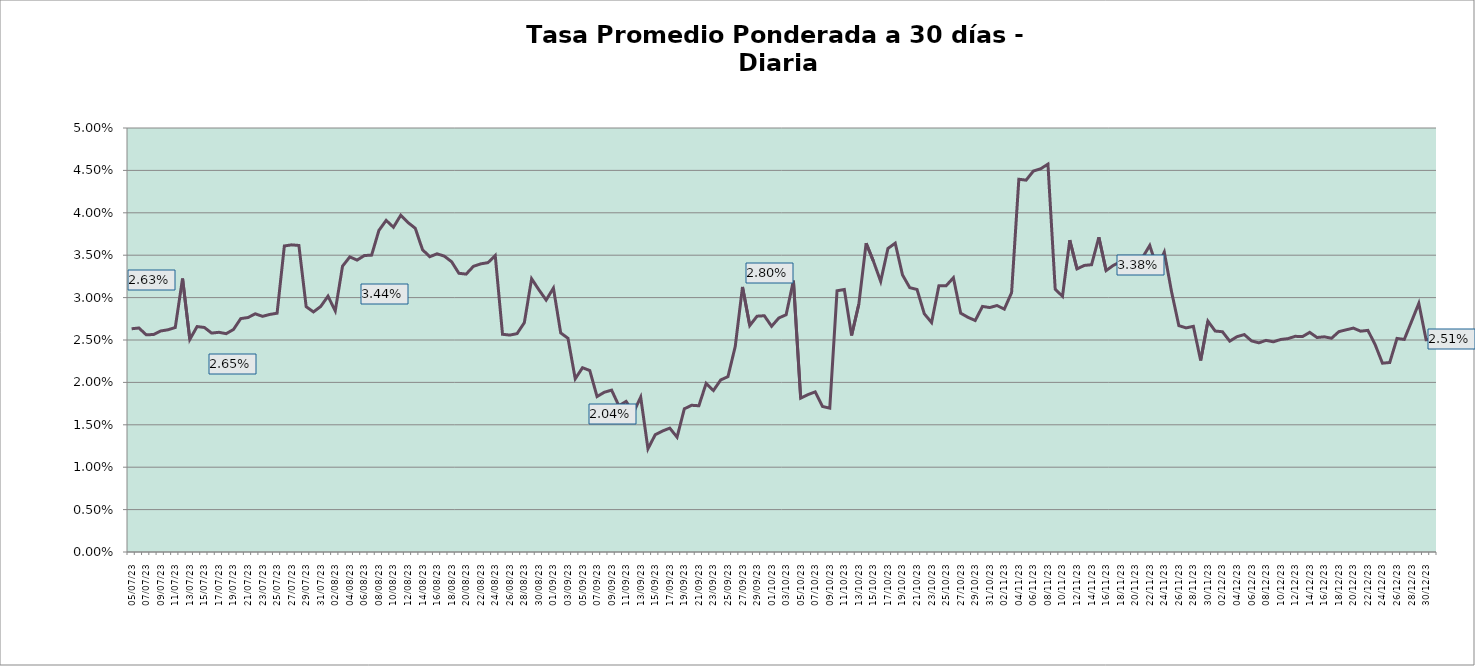
| Category | Tasa a 30 días |
|---|---|
| 2023-07-05 | 0.026 |
| 2023-07-06 | 0.026 |
| 2023-07-07 | 0.026 |
| 2023-07-08 | 0.026 |
| 2023-07-09 | 0.026 |
| 2023-07-10 | 0.026 |
| 2023-07-11 | 0.026 |
| 2023-07-12 | 0.032 |
| 2023-07-13 | 0.025 |
| 2023-07-14 | 0.027 |
| 2023-07-15 | 0.026 |
| 2023-07-16 | 0.026 |
| 2023-07-17 | 0.026 |
| 2023-07-18 | 0.026 |
| 2023-07-19 | 0.026 |
| 2023-07-20 | 0.028 |
| 2023-07-21 | 0.028 |
| 2023-07-22 | 0.028 |
| 2023-07-23 | 0.028 |
| 2023-07-24 | 0.028 |
| 2023-07-25 | 0.028 |
| 2023-07-26 | 0.036 |
| 2023-07-27 | 0.036 |
| 2023-07-28 | 0.036 |
| 2023-07-29 | 0.029 |
| 2023-07-30 | 0.028 |
| 2023-07-31 | 0.029 |
| 2023-08-01 | 0.03 |
| 2023-08-02 | 0.028 |
| 2023-08-03 | 0.034 |
| 2023-08-04 | 0.035 |
| 2023-08-05 | 0.034 |
| 2023-08-06 | 0.035 |
| 2023-08-07 | 0.035 |
| 2023-08-08 | 0.038 |
| 2023-08-09 | 0.039 |
| 2023-08-10 | 0.038 |
| 2023-08-11 | 0.04 |
| 2023-08-12 | 0.039 |
| 2023-08-13 | 0.038 |
| 2023-08-14 | 0.036 |
| 2023-08-15 | 0.035 |
| 2023-08-16 | 0.035 |
| 2023-08-17 | 0.035 |
| 2023-08-18 | 0.034 |
| 2023-08-19 | 0.033 |
| 2023-08-20 | 0.033 |
| 2023-08-21 | 0.034 |
| 2023-08-22 | 0.034 |
| 2023-08-23 | 0.034 |
| 2023-08-24 | 0.035 |
| 2023-08-25 | 0.026 |
| 2023-08-26 | 0.026 |
| 2023-08-27 | 0.026 |
| 2023-08-28 | 0.027 |
| 2023-08-29 | 0.032 |
| 2023-08-30 | 0.031 |
| 2023-08-31 | 0.03 |
| 2023-09-01 | 0.031 |
| 2023-09-02 | 0.026 |
| 2023-09-03 | 0.025 |
| 2023-09-04 | 0.02 |
| 2023-09-05 | 0.022 |
| 2023-09-06 | 0.021 |
| 2023-09-07 | 0.018 |
| 2023-09-08 | 0.019 |
| 2023-09-09 | 0.019 |
| 2023-09-10 | 0.017 |
| 2023-09-11 | 0.018 |
| 2023-09-12 | 0.016 |
| 2023-09-13 | 0.018 |
| 2023-09-14 | 0.012 |
| 2023-09-15 | 0.014 |
| 2023-09-16 | 0.014 |
| 2023-09-17 | 0.015 |
| 2023-09-18 | 0.014 |
| 2023-09-19 | 0.017 |
| 2023-09-20 | 0.017 |
| 2023-09-21 | 0.017 |
| 2023-09-22 | 0.02 |
| 2023-09-23 | 0.019 |
| 2023-09-24 | 0.02 |
| 2023-09-25 | 0.021 |
| 2023-09-26 | 0.024 |
| 2023-09-27 | 0.031 |
| 2023-09-28 | 0.027 |
| 2023-09-29 | 0.028 |
| 2023-09-30 | 0.028 |
| 2023-10-01 | 0.027 |
| 2023-10-02 | 0.028 |
| 2023-10-03 | 0.028 |
| 2023-10-04 | 0.032 |
| 2023-10-05 | 0.018 |
| 2023-10-06 | 0.019 |
| 2023-10-07 | 0.019 |
| 2023-10-08 | 0.017 |
| 2023-10-09 | 0.017 |
| 2023-10-10 | 0.031 |
| 2023-10-11 | 0.031 |
| 2023-10-12 | 0.026 |
| 2023-10-13 | 0.029 |
| 2023-10-14 | 0.036 |
| 2023-10-15 | 0.034 |
| 2023-10-16 | 0.032 |
| 2023-10-17 | 0.036 |
| 2023-10-18 | 0.036 |
| 2023-10-19 | 0.033 |
| 2023-10-20 | 0.031 |
| 2023-10-21 | 0.031 |
| 2023-10-22 | 0.028 |
| 2023-10-23 | 0.027 |
| 2023-10-24 | 0.031 |
| 2023-10-25 | 0.031 |
| 2023-10-26 | 0.032 |
| 2023-10-27 | 0.028 |
| 2023-10-28 | 0.028 |
| 2023-10-29 | 0.027 |
| 2023-10-30 | 0.029 |
| 2023-10-31 | 0.029 |
| 2023-11-01 | 0.029 |
| 2023-11-02 | 0.029 |
| 2023-11-03 | 0.031 |
| 2023-11-04 | 0.044 |
| 2023-11-05 | 0.044 |
| 2023-11-06 | 0.045 |
| 2023-11-07 | 0.045 |
| 2023-11-08 | 0.046 |
| 2023-11-09 | 0.031 |
| 2023-11-10 | 0.03 |
| 2023-11-11 | 0.037 |
| 2023-11-12 | 0.033 |
| 2023-11-13 | 0.034 |
| 2023-11-14 | 0.034 |
| 2023-11-15 | 0.037 |
| 2023-11-16 | 0.033 |
| 2023-11-17 | 0.034 |
| 2023-11-18 | 0.034 |
| 2023-11-19 | 0.034 |
| 2023-11-20 | 0.034 |
| 2023-11-21 | 0.035 |
| 2023-11-22 | 0.036 |
| 2023-11-23 | 0.034 |
| 2023-11-24 | 0.035 |
| 2023-11-25 | 0.031 |
| 2023-11-26 | 0.027 |
| 2023-11-27 | 0.026 |
| 2023-11-28 | 0.027 |
| 2023-11-29 | 0.023 |
| 2023-11-30 | 0.027 |
| 2023-12-01 | 0.026 |
| 2023-12-02 | 0.026 |
| 2023-12-03 | 0.025 |
| 2023-12-04 | 0.025 |
| 2023-12-05 | 0.026 |
| 2023-12-06 | 0.025 |
| 2023-12-07 | 0.025 |
| 2023-12-08 | 0.025 |
| 2023-12-09 | 0.025 |
| 2023-12-10 | 0.025 |
| 2023-12-11 | 0.025 |
| 2023-12-12 | 0.025 |
| 2023-12-13 | 0.025 |
| 2023-12-14 | 0.026 |
| 2023-12-15 | 0.025 |
| 2023-12-16 | 0.025 |
| 2023-12-17 | 0.025 |
| 2023-12-18 | 0.026 |
| 2023-12-19 | 0.026 |
| 2023-12-20 | 0.026 |
| 2023-12-21 | 0.026 |
| 2023-12-22 | 0.026 |
| 2023-12-23 | 0.024 |
| 2023-12-24 | 0.022 |
| 2023-12-25 | 0.022 |
| 2023-12-26 | 0.025 |
| 2023-12-27 | 0.025 |
| 2023-12-28 | 0.027 |
| 2023-12-29 | 0.029 |
| 2023-12-30 | 0.025 |
| 2023-12-31 | 0.025 |